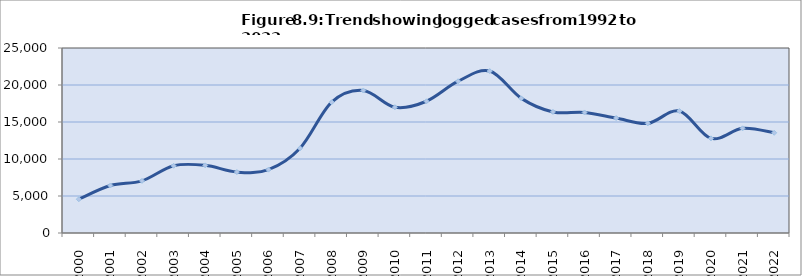
| Category | Series 1 |
|---|---|
| 2000.0 | 4567 |
| 2001.0 | 6417 |
| 2002.0 | 7045 |
| 2003.0 | 9085 |
| 2004.0 | 9140 |
| 2005.0 | 8230 |
| 2006.0 | 8560 |
| 2007.0 | 11452 |
| 2008.0 | 17674 |
| 2009.0 | 19259 |
| 2010.0 | 16994 |
| 2011.0 | 17803 |
| 2012.0 | 20512 |
| 2013.0 | 21885 |
| 2014.0 | 18193 |
| 2015.0 | 16362 |
| 2016.0 | 16287 |
| 2017.0 | 15535 |
| 2018.0 | 14811 |
| 2019.0 | 16480 |
| 2020.0 | 12787 |
| 2021.0 | 14143 |
| 2022.0 | 13543 |